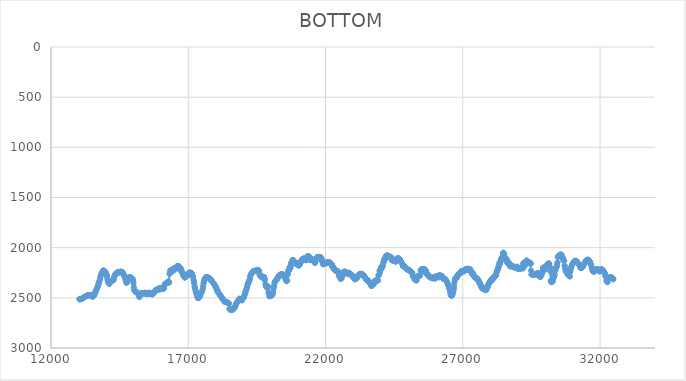
| Category | BOTTOM |
|---|---|
| 13032.9472 | 2514.32 |
| 13040.0809 | 2514.09 |
| 13050.3204 | 2513.85 |
| 13060.5605 | 2513.62 |
| 13070.8006 | 2513.38 |
| 13081.0407 | 2513.15 |
| 13091.2807 | 2512.92 |
| 13101.5208 | 2511.37 |
| 13111.7609 | 2509.81 |
| 13122.001 | 2508.24 |
| 13132.241 | 2506.68 |
| 13142.4811 | 2505.12 |
| 13152.7212 | 2503.55 |
| 13162.9612 | 2501.99 |
| 13173.2013 | 2500.42 |
| 13183.4414 | 2498.86 |
| 13193.6815 | 2496.93 |
| 13203.9215 | 2495 |
| 13214.1616 | 2493.06 |
| 13224.4017 | 2491.13 |
| 13234.6418 | 2489.19 |
| 13244.8818 | 2487.25 |
| 13255.1219 | 2485.32 |
| 13265.362 | 2483.38 |
| 13275.6021 | 2482.38 |
| 13285.8421 | 2481.4 |
| 13296.0822 | 2480.41 |
| 13306.3223 | 2479.43 |
| 13316.5624 | 2478.44 |
| 13326.8024 | 2477.46 |
| 13337.0425 | 2476.47 |
| 13347.2826 | 2475.49 |
| 13357.5226 | 2474.5 |
| 13367.7627 | 2473.51 |
| 13378.0028 | 2473.67 |
| 13388.2429 | 2473.85 |
| 13398.4829 | 2474.02 |
| 13408.723 | 2474.2 |
| 13418.9631 | 2474.37 |
| 13429.2032 | 2474.55 |
| 13439.4432 | 2474.73 |
| 13449.6833 | 2474.9 |
| 13459.9234 | 2477.21 |
| 13470.1635 | 2479.56 |
| 13480.4035 | 2481.9 |
| 13490.6436 | 2484.25 |
| 13500.8837 | 2486.6 |
| 13511.1238 | 2488.94 |
| 13521.3638 | 2486.45 |
| 13531.6039 | 2483.87 |
| 13541.844 | 2481.29 |
| 13552.084 | 2478.7 |
| 13562.3241 | 2476.12 |
| 13572.5642 | 2473.54 |
| 13582.8043 | 2466.03 |
| 13593.0443 | 2458.43 |
| 13603.2844 | 2450.83 |
| 13613.5245 | 2443.23 |
| 13623.7646 | 2435.63 |
| 13634.0046 | 2429.57 |
| 13644.2447 | 2423.54 |
| 13654.4848 | 2417.5 |
| 13664.7249 | 2411.47 |
| 13674.9649 | 2405.44 |
| 13685.205 | 2399.41 |
| 13695.4451 | 2393.37 |
| 13705.6852 | 2384.45 |
| 13715.9252 | 2375.48 |
| 13726.1653 | 2366.51 |
| 13736.4054 | 2357.53 |
| 13746.6454 | 2348.56 |
| 13756.8855 | 2339.59 |
| 13767.1256 | 2330.61 |
| 13777.3657 | 2321.64 |
| 13787.6057 | 2309.39 |
| 13797.8458 | 2297.07 |
| 13808.0859 | 2284.75 |
| 13818.326 | 2272.44 |
| 13828.566 | 2266.68 |
| 13838.8061 | 2261.05 |
| 13849.0462 | 2255.42 |
| 13859.2863 | 2249.79 |
| 13869.5263 | 2244.16 |
| 13879.7664 | 2238.53 |
| 13890.0065 | 2232.9 |
| 13900.2466 | 2227.27 |
| 13910.4866 | 2229.06 |
| 13920.7267 | 2231 |
| 13930.9668 | 2232.94 |
| 13941.2068 | 2234.87 |
| 13951.4469 | 2236.81 |
| 13961.687 | 2238.74 |
| 13971.9271 | 2240.68 |
| 13982.1671 | 2242.61 |
| 13992.4072 | 2249 |
| 14002.6473 | 2255.48 |
| 14012.8874 | 2261.95 |
| 14023.1274 | 2268.43 |
| 14033.3675 | 2274.9 |
| 14043.6076 | 2292.97 |
| 14053.8477 | 2311.27 |
| 14064.0877 | 2329.57 |
| 14074.3278 | 2336.27 |
| 14084.5679 | 2342.75 |
| 14094.808 | 2349.22 |
| 14105.048 | 2355.7 |
| 14115.2881 | 2362.17 |
| 14125.5282 | 2358.39 |
| 14135.7682 | 2354.4 |
| 14146.0083 | 2350.41 |
| 14156.2484 | 2346.42 |
| 14166.4885 | 2342.43 |
| 14176.7285 | 2338.45 |
| 14186.9686 | 2336.07 |
| 14197.2087 | 2333.72 |
| 14207.4488 | 2331.38 |
| 14217.6888 | 2329.03 |
| 14227.9289 | 2326.68 |
| 14238.169 | 2324.34 |
| 14248.4091 | 2324.29 |
| 14258.6491 | 2324.29 |
| 14268.8892 | 2324.29 |
| 14279.1293 | 2324.29 |
| 14289.3694 | 2308.43 |
| 14299.6094 | 2292.24 |
| 14309.8495 | 2285.85 |
| 14320.0896 | 2279.65 |
| 14330.3296 | 2273.46 |
| 14340.5697 | 2267.27 |
| 14350.8098 | 2261.07 |
| 14361.0499 | 2258.65 |
| 14371.2899 | 2256.3 |
| 14381.53 | 2253.96 |
| 14391.7701 | 2251.61 |
| 14402.0102 | 2249.27 |
| 14412.2502 | 2246.92 |
| 14422.4903 | 2246.87 |
| 14432.7304 | 2246.87 |
| 14442.9705 | 2246.87 |
| 14453.2105 | 2246.87 |
| 14463.4506 | 2246.87 |
| 14473.6907 | 2246.87 |
| 14483.9308 | 2246.87 |
| 14494.1708 | 2245.22 |
| 14504.4109 | 2243.53 |
| 14514.651 | 2241.84 |
| 14524.891 | 2240.15 |
| 14535.1311 | 2238.46 |
| 14545.3712 | 2239.57 |
| 14555.6113 | 2240.75 |
| 14565.8513 | 2241.92 |
| 14576.0914 | 2243.09 |
| 14586.3315 | 2244.27 |
| 14596.5716 | 2245.44 |
| 14606.8116 | 2244.09 |
| 14617.0517 | 2260.59 |
| 14627.2918 | 2256.81 |
| 14637.5319 | 2263.61 |
| 14647.7719 | 2272.03 |
| 14658.012 | 2277.72 |
| 14668.2521 | 2280.59 |
| 14678.4922 | 2283.41 |
| 14688.7322 | 2298.62 |
| 14698.9723 | 2301.71 |
| 14709.2124 | 2301.77 |
| 14719.4524 | 2325.18 |
| 14729.6925 | 2324.32 |
| 14739.9326 | 2349.08 |
| 14750.1727 | 2342.74 |
| 14760.4127 | 2349.48 |
| 14770.6528 | 2323.46 |
| 14780.8929 | 2325.64 |
| 14791.133 | 2322.94 |
| 14801.373 | 2328.39 |
| 14811.6131 | 2328.51 |
| 14821.8532 | 2300.98 |
| 14832.0933 | 2294.85 |
| 14842.3333 | 2300.24 |
| 14852.5734 | 2299.26 |
| 14862.8135 | 2298.13 |
| 14873.0536 | 2297.01 |
| 14883.2936 | 2295.88 |
| 14893.5337 | 2294.76 |
| 14903.7738 | 2297.48 |
| 14914.0139 | 2300.3 |
| 14924.2539 | 2303.11 |
| 14934.494 | 2305.93 |
| 14944.7341 | 2308.74 |
| 14954.9741 | 2311.56 |
| 14965.2142 | 2314.37 |
| 14975.4543 | 2308.93 |
| 14985.6944 | 2325.32 |
| 14995.9344 | 2332.58 |
| 15006.1745 | 2356.13 |
| 15016.4146 | 2392.44 |
| 15026.6547 | 2415.28 |
| 15036.8947 | 2422.67 |
| 15047.1348 | 2429.7 |
| 15057.3749 | 2427.11 |
| 15067.615 | 2433.93 |
| 15077.855 | 2440.96 |
| 15088.0951 | 2439.75 |
| 15098.3352 | 2439.72 |
| 15108.5753 | 2445.22 |
| 15118.8153 | 2445.35 |
| 15129.0554 | 2445.35 |
| 15139.2955 | 2450.85 |
| 15149.5355 | 2450.98 |
| 15159.7756 | 2453.73 |
| 15170.0157 | 2453.79 |
| 15180.2558 | 2459.29 |
| 15190.4958 | 2463.55 |
| 15200.7359 | 2473.27 |
| 15210.976 | 2484.5 |
| 15221.2161 | 2494.38 |
| 15231.4561 | 2472.61 |
| 15241.6962 | 2466.59 |
| 15251.9363 | 2466.46 |
| 15262.1764 | 2459.59 |
| 15272.4164 | 2458.05 |
| 15282.6565 | 2456.64 |
| 15292.8966 | 2449.73 |
| 15303.1367 | 2453.69 |
| 15313.3767 | 2452.42 |
| 15323.6168 | 2456.51 |
| 15333.8569 | 2453.86 |
| 15344.097 | 2453.79 |
| 15354.337 | 2453.79 |
| 15364.5771 | 2455.17 |
| 15374.8172 | 2452.45 |
| 15385.0572 | 2456.51 |
| 15395.2973 | 2456.61 |
| 15405.5374 | 2451.11 |
| 15415.7775 | 2450.98 |
| 15426.0175 | 2450.98 |
| 15436.2576 | 2448.23 |
| 15446.4977 | 2450.91 |
| 15456.7378 | 2460.59 |
| 15466.9778 | 2460.83 |
| 15477.2179 | 2460.83 |
| 15487.458 | 2460.83 |
| 15497.6981 | 2460.83 |
| 15507.9381 | 2460.83 |
| 15518.1782 | 2460.83 |
| 15528.4183 | 2460.83 |
| 15538.6584 | 2460.83 |
| 15548.8984 | 2451.22 |
| 15559.1385 | 2448.23 |
| 15569.3786 | 2450.91 |
| 15579.6186 | 2460.59 |
| 15589.8587 | 2460.83 |
| 15600.0988 | 2460.83 |
| 15610.3389 | 2460.83 |
| 15620.5789 | 2460.83 |
| 15630.819 | 2460.83 |
| 15641.0591 | 2455.34 |
| 15651.2992 | 2457.4 |
| 15661.5392 | 2459.65 |
| 15671.7793 | 2461.9 |
| 15682.0194 | 2464.15 |
| 15692.2595 | 2466.4 |
| 15702.4995 | 2463.44 |
| 15712.7396 | 2460.34 |
| 15722.9797 | 2457.25 |
| 15733.2198 | 2454.15 |
| 15743.4598 | 2451.05 |
| 15753.6999 | 2441.37 |
| 15763.94 | 2443.87 |
| 15774.1801 | 2442.57 |
| 15784.4201 | 2435.67 |
| 15794.6602 | 2435.49 |
| 15804.9003 | 2425.89 |
| 15815.1403 | 2421.52 |
| 15825.3804 | 2425.53 |
| 15835.6205 | 2422.89 |
| 15845.8606 | 2420.08 |
| 15856.1006 | 2415.89 |
| 15866.3407 | 2414.41 |
| 15876.5808 | 2414.38 |
| 15886.8209 | 2415.75 |
| 15897.0609 | 2414.41 |
| 15907.301 | 2414.38 |
| 15917.5411 | 2413.01 |
| 15927.7812 | 2419.83 |
| 15938.0212 | 2411.78 |
| 15948.2613 | 2403.33 |
| 15958.5014 | 2405.86 |
| 15968.7415 | 2404.56 |
| 15978.9815 | 2404.53 |
| 15989.2216 | 2414.13 |
| 15999.4617 | 2414.38 |
| 16009.7018 | 2403.41 |
| 16019.9418 | 2403.12 |
| 16030.1819 | 2403.12 |
| 16040.422 | 2404.49 |
| 16050.662 | 2404.53 |
| 16060.9021 | 2405.9 |
| 16071.1422 | 2405.93 |
| 16081.3823 | 2401.82 |
| 16091.6223 | 2408.56 |
| 16101.8624 | 2408.75 |
| 16112.1025 | 2407.38 |
| 16122.3426 | 2404.6 |
| 16132.5826 | 2371.63 |
| 16142.8227 | 2368 |
| 16153.0628 | 2363.81 |
| 16163.3029 | 2358.22 |
| 16173.5429 | 2360.81 |
| 16183.783 | 2359.52 |
| 16194.0231 | 2354 |
| 16204.2632 | 2355.22 |
| 16214.5032 | 2348.41 |
| 16224.7433 | 2348.22 |
| 16234.9834 | 2346.85 |
| 16245.2235 | 2341.33 |
| 16255.4635 | 2350.77 |
| 16265.7036 | 2338.7 |
| 16275.9437 | 2341.11 |
| 16286.1837 | 2341.18 |
| 16296.4238 | 2339.81 |
| 16306.6639 | 2347.99 |
| 16316.904 | 2260.55 |
| 16327.144 | 2258.13 |
| 16337.3841 | 2228 |
| 16347.6242 | 2249.08 |
| 16357.8643 | 2223.66 |
| 16368.1043 | 2225.68 |
| 16378.3444 | 2225.76 |
| 16388.5845 | 2224.39 |
| 16398.8246 | 2242.15 |
| 16409.0646 | 2220.74 |
| 16419.3047 | 2217.39 |
| 16429.5448 | 2217.31 |
| 16439.7849 | 2215.94 |
| 16450.0249 | 2217.27 |
| 16460.265 | 2209.1 |
| 16470.5051 | 2210.24 |
| 16480.7452 | 2207.54 |
| 16490.9852 | 2206.09 |
| 16501.2253 | 2223.85 |
| 16511.4654 | 2210.66 |
| 16521.7054 | 2207.54 |
| 16531.9455 | 2203.35 |
| 16542.1856 | 2205.97 |
| 16552.4257 | 2195.1 |
| 16562.6657 | 2194.79 |
| 16572.9058 | 2203 |
| 16583.1459 | 2185.44 |
| 16593.386 | 2184.94 |
| 16603.626 | 2184.94 |
| 16613.8661 | 2182.2 |
| 16624.1062 | 2182.12 |
| 16634.3463 | 2183.49 |
| 16644.5863 | 2183.53 |
| 16654.8264 | 2195.84 |
| 16665.0665 | 2194.83 |
| 16675.3066 | 2193.42 |
| 16685.5466 | 2198.86 |
| 16695.7867 | 2196.28 |
| 16706.0268 | 2223.56 |
| 16716.2669 | 2214.77 |
| 16726.5069 | 2206.29 |
| 16736.747 | 2214.26 |
| 16746.9871 | 2221.34 |
| 16757.2271 | 2232.48 |
| 16767.4672 | 2245.11 |
| 16777.7073 | 2245.46 |
| 16787.9474 | 2248.2 |
| 16798.1874 | 2257.85 |
| 16808.4275 | 2267.71 |
| 16818.6676 | 2277.56 |
| 16828.9077 | 2279.21 |
| 16839.1477 | 2279.25 |
| 16849.3878 | 2280.61 |
| 16859.6279 | 2287.49 |
| 16869.868 | 2298.63 |
| 16880.108 | 2297.59 |
| 16890.3481 | 2287.98 |
| 16900.5882 | 2286.33 |
| 16910.8283 | 2286.29 |
| 16921.0683 | 2287.65 |
| 16931.3084 | 2282.22 |
| 16941.5485 | 2286.16 |
| 16951.7886 | 2275.35 |
| 16962.0286 | 2275.02 |
| 16972.2687 | 2268.19 |
| 16982.5088 | 2258.42 |
| 16992.7488 | 2269.07 |
| 17002.9889 | 2270.76 |
| 17013.229 | 2268.07 |
| 17023.4691 | 2267.99 |
| 17033.7091 | 2257.05 |
| 17043.9492 | 2248.53 |
| 17054.1893 | 2248.28 |
| 17064.4294 | 2249.65 |
| 17074.6694 | 2249.69 |
| 17084.9095 | 2249.69 |
| 17095.1496 | 2251.05 |
| 17105.3897 | 2252.46 |
| 17115.6297 | 2252.5 |
| 17125.8698 | 2256.6 |
| 17136.1099 | 2270.39 |
| 17146.35 | 2277.63 |
| 17156.59 | 2280.57 |
| 17166.8301 | 2283.39 |
| 17177.0702 | 2288.93 |
| 17187.3103 | 2319.15 |
| 17197.5503 | 2325.53 |
| 17207.7904 | 2351.65 |
| 17218.0305 | 2352.44 |
| 17228.2706 | 2385.22 |
| 17238.5106 | 2394.42 |
| 17248.7507 | 2408.33 |
| 17258.9908 | 2419.67 |
| 17269.2308 | 2433.66 |
| 17279.4709 | 2445.01 |
| 17289.711 | 2446.71 |
| 17299.9511 | 2464.5 |
| 17310.1911 | 2467.78 |
| 17320.4312 | 2470.6 |
| 17330.6713 | 2485.7 |
| 17340.9114 | 2501.18 |
| 17351.1514 | 2501.65 |
| 17361.3915 | 2498.92 |
| 17371.6316 | 2501.57 |
| 17381.8717 | 2501.65 |
| 17392.1117 | 2497.21 |
| 17402.3518 | 2492.64 |
| 17412.5919 | 2488.07 |
| 17422.832 | 2483.49 |
| 17433.072 | 2473.8 |
| 17443.3121 | 2463.95 |
| 17453.5522 | 2454.09 |
| 17463.7923 | 2450.24 |
| 17474.0323 | 2446.58 |
| 17484.2724 | 2442.92 |
| 17494.5125 | 2439.26 |
| 17504.7526 | 2435.61 |
| 17514.9926 | 2423.21 |
| 17525.2327 | 2410.55 |
| 17535.4728 | 2397.88 |
| 17545.7128 | 2377.02 |
| 17555.9529 | 2355.91 |
| 17566.193 | 2343.89 |
| 17576.4331 | 2332.16 |
| 17586.6731 | 2320.43 |
| 17596.9132 | 2315.16 |
| 17607.1533 | 2310.09 |
| 17617.3934 | 2305.02 |
| 17627.6334 | 2299.96 |
| 17637.8735 | 2294.89 |
| 17648.1136 | 2293.37 |
| 17658.3537 | 2291.96 |
| 17668.5937 | 2292.94 |
| 17678.8338 | 2293.99 |
| 17689.0739 | 2295.05 |
| 17699.314 | 2296.11 |
| 17709.554 | 2297.16 |
| 17719.7941 | 2298.22 |
| 17730.0342 | 2299.27 |
| 17740.2743 | 2300.33 |
| 17750.5143 | 2302.07 |
| 17760.7544 | 2303.82 |
| 17770.9945 | 2305.58 |
| 17781.2346 | 2307.34 |
| 17791.4746 | 2310.67 |
| 17801.7147 | 2314.05 |
| 17811.9548 | 2317.43 |
| 17822.1948 | 2320.81 |
| 17832.4349 | 2324.18 |
| 17842.675 | 2327.7 |
| 17852.9151 | 2331.22 |
| 17863.1551 | 2334.74 |
| 17873.3952 | 2338.25 |
| 17883.6353 | 2341.77 |
| 17893.8754 | 2345.29 |
| 17904.1154 | 2348.81 |
| 17914.3555 | 2352.33 |
| 17924.5956 | 2356.8 |
| 17934.8357 | 2361.31 |
| 17945.0757 | 2365.81 |
| 17955.3158 | 2370.32 |
| 17965.5559 | 2374.82 |
| 17975.796 | 2379.87 |
| 17986.036 | 2384.94 |
| 17996.2761 | 2390 |
| 18006.5162 | 2395.07 |
| 18016.7563 | 2400.14 |
| 18026.9963 | 2407.11 |
| 18037.2364 | 2414.15 |
| 18047.4765 | 2421.19 |
| 18057.7166 | 2428.23 |
| 18067.9566 | 2435.26 |
| 18078.1967 | 2439.58 |
| 18088.4368 | 2443.8 |
| 18098.6768 | 2448.02 |
| 18108.9169 | 2452.25 |
| 18119.157 | 2456.47 |
| 18129.3971 | 2460.69 |
| 18139.6371 | 2464.91 |
| 18149.8772 | 2469.14 |
| 18160.1173 | 2473.13 |
| 18170.3574 | 2477.12 |
| 18180.5974 | 2481.11 |
| 18190.8375 | 2485.1 |
| 18201.0776 | 2489.08 |
| 18211.3177 | 2493.07 |
| 18221.5577 | 2497.46 |
| 18231.7978 | 2501.86 |
| 18242.0379 | 2506.26 |
| 18252.278 | 2510.65 |
| 18262.518 | 2515.05 |
| 18272.7581 | 2519.45 |
| 18282.9982 | 2523.85 |
| 18293.2383 | 2528.25 |
| 18303.4783 | 2528.4 |
| 18313.7184 | 2535.2 |
| 18323.9585 | 2535.43 |
| 18334.1986 | 2540.88 |
| 18344.4386 | 2538.34 |
| 18354.6787 | 2539.61 |
| 18364.9188 | 2541.02 |
| 18375.1588 | 2541.06 |
| 18385.3989 | 2541.06 |
| 18395.639 | 2542.42 |
| 18405.8791 | 2542.47 |
| 18416.1191 | 2547.91 |
| 18426.3592 | 2548.1 |
| 18436.5993 | 2548.1 |
| 18446.8394 | 2549.46 |
| 18457.0794 | 2550.87 |
| 18467.3195 | 2553.64 |
| 18477.5596 | 2553.73 |
| 18487.7997 | 2556.45 |
| 18498.0397 | 2609.58 |
| 18508.2798 | 2607.37 |
| 18518.5199 | 2619.46 |
| 18528.76 | 2617.17 |
| 18539.0 | 2607.56 |
| 18549.2401 | 2615.38 |
| 18559.4802 | 2615.67 |
| 18569.7203 | 2614.31 |
| 18579.9603 | 2615.62 |
| 18590.2004 | 2615.67 |
| 18600.4405 | 2617.03 |
| 18610.6806 | 2615.72 |
| 18620.9206 | 2615.67 |
| 18631.1607 | 2614.31 |
| 18641.4008 | 2614.26 |
| 18651.6409 | 2611.54 |
| 18661.8809 | 2607.37 |
| 18672.121 | 2603.15 |
| 18682.3611 | 2598.92 |
| 18692.6011 | 2594.7 |
| 18702.8412 | 2590.48 |
| 18713.0813 | 2581.73 |
| 18723.3214 | 2572.81 |
| 18733.5614 | 2563.9 |
| 18743.8015 | 2559.41 |
| 18754.0416 | 2555.07 |
| 18764.2817 | 2550.74 |
| 18774.5217 | 2546.41 |
| 18784.7618 | 2542.08 |
| 18795.0019 | 2537.75 |
| 18805.242 | 2533.42 |
| 18815.482 | 2529.09 |
| 18825.7221 | 2524.76 |
| 18835.9622 | 2520.43 |
| 18846.2023 | 2516.1 |
| 18856.4423 | 2511.76 |
| 18866.6824 | 2507.43 |
| 18876.9225 | 2510.68 |
| 18887.1626 | 2514.19 |
| 18897.4026 | 2512.96 |
| 18907.6427 | 2518.34 |
| 18917.8828 | 2521.26 |
| 18928.1229 | 2521.36 |
| 18938.3629 | 2522.71 |
| 18948.603 | 2525.48 |
| 18958.8431 | 2525.58 |
| 18969.0831 | 2512 |
| 18979.3232 | 2506.07 |
| 18989.5633 | 2503.16 |
| 18999.8034 | 2500.34 |
| 19010.0434 | 2497.53 |
| 19020.2835 | 2494.71 |
| 19030.5236 | 2491.9 |
| 19040.7637 | 2481.84 |
| 19051.0037 | 2471.52 |
| 19061.2438 | 2461.2 |
| 19071.4839 | 2452.88 |
| 19081.724 | 2444.64 |
| 19091.964 | 2436.39 |
| 19102.2041 | 2428.15 |
| 19112.4442 | 2419.9 |
| 19122.6843 | 2411.66 |
| 19132.9243 | 2403.42 |
| 19143.1644 | 2390.45 |
| 19153.4045 | 2377.32 |
| 19163.6446 | 2364.18 |
| 19173.8846 | 2357.7 |
| 19184.1247 | 2351.46 |
| 19194.3648 | 2345.23 |
| 19204.6049 | 2339 |
| 19214.8449 | 2332.76 |
| 19225.085 | 2326.53 |
| 19235.3251 | 2320.3 |
| 19245.5652 | 2305.15 |
| 19255.8052 | 2289.67 |
| 19266.0453 | 2274.18 |
| 19276.2854 | 2269.4 |
| 19286.5255 | 2265.02 |
| 19296.7655 | 2260.64 |
| 19307.0056 | 2256.26 |
| 19317.2457 | 2251.88 |
| 19327.4857 | 2247.5 |
| 19337.7258 | 2243.12 |
| 19347.9659 | 2238.74 |
| 19358.206 | 2234.37 |
| 19368.446 | 2233.73 |
| 19378.6861 | 2233.23 |
| 19388.9262 | 2232.73 |
| 19399.1663 | 2232.23 |
| 19409.4063 | 2231.74 |
| 19419.6464 | 2231.24 |
| 19429.8865 | 2230.74 |
| 19440.1266 | 2230.25 |
| 19450.3666 | 2229.75 |
| 19460.6067 | 2229.25 |
| 19470.8468 | 2228.76 |
| 19481.0869 | 2228.26 |
| 19491.3269 | 2227.76 |
| 19501.567 | 2227.27 |
| 19511.8071 | 2226.77 |
| 19522.0472 | 2226.27 |
| 19532.2872 | 2225.78 |
| 19542.5273 | 2224.4 |
| 19552.7674 | 2224.35 |
| 19563.0075 | 2227.06 |
| 19573.2475 | 2228.52 |
| 19583.4876 | 2242.12 |
| 19593.7277 | 2268.39 |
| 19603.9678 | 2277.52 |
| 19614.2078 | 2279.19 |
| 19624.4479 | 2272.47 |
| 19634.688 | 2281.69 |
| 19644.928 | 2278 |
| 19655.1681 | 2294.09 |
| 19665.4082 | 2279.83 |
| 19675.6483 | 2280.6 |
| 19685.8883 | 2287.43 |
| 19696.1284 | 2290.4 |
| 19706.3685 | 2291.86 |
| 19716.6086 | 2290.56 |
| 19726.8486 | 2290.51 |
| 19737.0887 | 2291.86 |
| 19747.3288 | 2291.92 |
| 19757.5689 | 2291.92 |
| 19767.8089 | 2295.98 |
| 19778.049 | 2320.51 |
| 19788.2891 | 2317.41 |
| 19798.5292 | 2318.61 |
| 19808.7692 | 2360.62 |
| 19819.0093 | 2381.25 |
| 19829.2494 | 2382 |
| 19839.4895 | 2380.65 |
| 19849.7295 | 2380.6 |
| 19859.9696 | 2399.54 |
| 19870.2097 | 2392.18 |
| 19880.4498 | 2382.38 |
| 19890.6898 | 2398.24 |
| 19900.9299 | 2389.42 |
| 19911.17 | 2390.39 |
| 19921.4101 | 2445.92 |
| 19931.6501 | 2458.99 |
| 19941.8902 | 2456.72 |
| 19952.1303 | 2485.02 |
| 19962.3704 | 2478.05 |
| 19972.6104 | 2483.13 |
| 19982.8505 | 2480.65 |
| 19993.0906 | 2480.54 |
| 20003.3306 | 2480.54 |
| 20013.5707 | 2475.13 |
| 20023.8108 | 2477.61 |
| 20034.0509 | 2477.72 |
| 20044.2909 | 2472.31 |
| 20054.531 | 2468.03 |
| 20064.7711 | 2467.87 |
| 20075.0112 | 2458.4 |
| 20085.2512 | 2456.66 |
| 20095.4913 | 2436.32 |
| 20105.7314 | 2408.45 |
| 20115.9715 | 2393.82 |
| 20126.2115 | 2379.74 |
| 20136.4516 | 2354.85 |
| 20146.6917 | 2345.74 |
| 20156.9318 | 2337.29 |
| 20167.1718 | 2335.61 |
| 20177.4119 | 2332.85 |
| 20187.652 | 2324.63 |
| 20197.8921 | 2329.7 |
| 20208.1321 | 2319.11 |
| 20218.3722 | 2315.96 |
| 20228.6123 | 2314.49 |
| 20238.8524 | 2314.44 |
| 20249.0924 | 2313.09 |
| 20259.3325 | 2295.46 |
| 20269.5726 | 2300.14 |
| 20279.8127 | 2285.5 |
| 20290.0527 | 2284.88 |
| 20300.2928 | 2284.88 |
| 20310.5329 | 2279.47 |
| 20320.773 | 2277.9 |
| 20331.013 | 2277.84 |
| 20341.2531 | 2275.14 |
| 20351.4932 | 2266.92 |
| 20361.7333 | 2271.98 |
| 20371.9733 | 2272.21 |
| 20382.2134 | 2270.86 |
| 20392.4535 | 2269.45 |
| 20402.6935 | 2266.69 |
| 20412.9336 | 2262.53 |
| 20423.1737 | 2274.51 |
| 20433.4138 | 2265.57 |
| 20443.6538 | 2263.82 |
| 20453.8939 | 2271.87 |
| 20464.134 | 2270.86 |
| 20474.3741 | 2276.2 |
| 20484.6141 | 2291.29 |
| 20494.8542 | 2281.11 |
| 20505.0943 | 2291.46 |
| 20515.3344 | 2293.27 |
| 20525.5744 | 2301.42 |
| 20535.8145 | 2301.77 |
| 20546.0546 | 2297.72 |
| 20556.2947 | 2302.95 |
| 20566.5347 | 2330.18 |
| 20576.7748 | 2335.38 |
| 20587.0149 | 2328.8 |
| 20597.255 | 2328.51 |
| 20607.495 | 2328.51 |
| 20617.7351 | 2259.67 |
| 20627.9752 | 2266.17 |
| 20638.2153 | 2231.49 |
| 20648.4553 | 2231.33 |
| 20658.6954 | 2227.34 |
| 20668.9355 | 2224.47 |
| 20679.1756 | 2223 |
| 20689.4156 | 2195.95 |
| 20699.6557 | 2193.44 |
| 20709.8958 | 2202.83 |
| 20720.1359 | 2183 |
| 20730.3759 | 2196.96 |
| 20740.616 | 2157.13 |
| 20750.8561 | 2155.38 |
| 20761.0962 | 2147.28 |
| 20771.3362 | 2145.58 |
| 20781.5763 | 2149.57 |
| 20791.8164 | 2122.77 |
| 20802.0564 | 2140.48 |
| 20812.2965 | 2123.77 |
| 20822.5366 | 2123 |
| 20832.7767 | 2147.28 |
| 20843.0167 | 2155.08 |
| 20853.2568 | 2140.54 |
| 20863.4969 | 2145.29 |
| 20873.737 | 2145.52 |
| 20883.977 | 2153.62 |
| 20894.2171 | 2144.53 |
| 20904.4572 | 2157.6 |
| 20914.6973 | 2154.15 |
| 20924.9373 | 2154.64 |
| 20935.1774 | 2155.35 |
| 20945.4175 | 2156.05 |
| 20955.6576 | 2156.75 |
| 20965.8976 | 2160.38 |
| 20976.1377 | 2164.13 |
| 20986.3778 | 2167.89 |
| 20996.6179 | 2171.64 |
| 21006.8579 | 2175.39 |
| 21017.098 | 2179.15 |
| 21027.3381 | 2176.95 |
| 21037.5782 | 2174.48 |
| 21047.8182 | 2172.02 |
| 21058.0583 | 2169.56 |
| 21068.2984 | 2163.22 |
| 21078.5385 | 2156.71 |
| 21088.7785 | 2150.2 |
| 21099.0186 | 2143.69 |
| 21109.2587 | 2137.18 |
| 21119.4988 | 2130.67 |
| 21129.7388 | 2124.16 |
| 21139.9789 | 2117.65 |
| 21150.219 | 2115.8 |
| 21160.4591 | 2114.16 |
| 21170.6991 | 2112.52 |
| 21180.9392 | 2110.87 |
| 21191.1793 | 2109.23 |
| 21201.4193 | 2107.59 |
| 21211.6594 | 2110.21 |
| 21221.8995 | 2111.68 |
| 21232.1396 | 2113.09 |
| 21242.3796 | 2122.58 |
| 21252.6197 | 2124.35 |
| 21262.8598 | 2124.41 |
| 21273.0999 | 2123.06 |
| 21283.3399 | 2124.35 |
| 21293.58 | 2124.41 |
| 21303.8201 | 2117.68 |
| 21314.0602 | 2095.83 |
| 21324.3002 | 2094.85 |
| 21334.5403 | 2089.46 |
| 21344.7804 | 2087.87 |
| 21355.0205 | 2085.12 |
| 21365.2605 | 2083.65 |
| 21375.5006 | 2083.59 |
| 21385.7407 | 2087.63 |
| 21395.9808 | 2086.47 |
| 21406.2208 | 2091.79 |
| 21416.4609 | 2093.38 |
| 21426.701 | 2094.79 |
| 21436.9411 | 2124.46 |
| 21447.1811 | 2123.13 |
| 21457.4212 | 2123 |
| 21467.6613 | 2124.35 |
| 21477.9014 | 2124.41 |
| 21488.1414 | 2123.06 |
| 21498.3815 | 2117.62 |
| 21508.6216 | 2117.37 |
| 21518.8617 | 2117.37 |
| 21529.1017 | 2121.41 |
| 21539.3418 | 2118.9 |
| 21549.5819 | 2121.47 |
| 21559.822 | 2131.01 |
| 21570.062 | 2130.1 |
| 21580.3021 | 2130.04 |
| 21590.5422 | 2134.08 |
| 21600.7823 | 2147.72 |
| 21611.0223 | 2151.03 |
| 21621.2624 | 2152.5 |
| 21631.5025 | 2136.42 |
| 21641.7426 | 2115.49 |
| 21651.9826 | 2107.83 |
| 21662.2227 | 2108.86 |
| 21672.4628 | 2107.58 |
| 21682.7028 | 2099.45 |
| 21692.9429 | 2093.69 |
| 21703.183 | 2097.48 |
| 21713.4231 | 2093.63 |
| 21723.6631 | 2092.1 |
| 21733.9032 | 2094.72 |
| 21744.1433 | 2092.16 |
| 21754.3834 | 2092.03 |
| 21764.6234 | 2092.03 |
| 21774.8635 | 2092.03 |
| 21785.1036 | 2093.38 |
| 21795.3437 | 2093.44 |
| 21805.5837 | 2096.13 |
| 21815.8238 | 2097.6 |
| 21826.0639 | 2097.66 |
| 21836.304 | 2101.7 |
| 21846.544 | 2105.92 |
| 21856.7841 | 2134.34 |
| 21867.0242 | 2131.64 |
| 21877.2643 | 2130.1 |
| 21887.5043 | 2126.01 |
| 21897.7444 | 2129.85 |
| 21907.9845 | 2166.32 |
| 21918.2246 | 2164.01 |
| 21928.4646 | 2159.79 |
| 21938.7047 | 2160.94 |
| 21948.9448 | 2158.32 |
| 21959.1849 | 2156.85 |
| 21969.4249 | 2156.78 |
| 21979.665 | 2155.44 |
| 21989.9051 | 2155.38 |
| 22000.1452 | 2152.69 |
| 22010.3852 | 2153.91 |
| 22020.6253 | 2153.97 |
| 22030.8654 | 2155.31 |
| 22041.1055 | 2155.38 |
| 22051.3455 | 2152.69 |
| 22061.5856 | 2152.56 |
| 22071.8257 | 2145.85 |
| 22082.0658 | 2144.18 |
| 22092.3058 | 2145.46 |
| 22102.5459 | 2145.52 |
| 22112.786 | 2145.52 |
| 22123.0261 | 2145.52 |
| 22133.2661 | 2146.87 |
| 22143.5062 | 2146.93 |
| 22153.7463 | 2148.27 |
| 22163.9864 | 2152.37 |
| 22174.2264 | 2156.59 |
| 22184.4665 | 2158.13 |
| 22194.7066 | 2159.53 |
| 22204.9466 | 2163.63 |
| 22215.1867 | 2163.82 |
| 22225.4268 | 2163.82 |
| 22235.6669 | 2167.85 |
| 22245.9069 | 2188.18 |
| 22256.147 | 2186.48 |
| 22266.3871 | 2187.69 |
| 22276.6272 | 2187.75 |
| 22286.8672 | 2207.88 |
| 22297.1073 | 2204.84 |
| 22307.3474 | 2201.96 |
| 22317.5875 | 2216.59 |
| 22327.8275 | 2218.65 |
| 22338.0676 | 2218.72 |
| 22348.3077 | 2220.06 |
| 22358.5478 | 2229.52 |
| 22368.7878 | 2229.98 |
| 22379.0279 | 2227.3 |
| 22389.268 | 2228.51 |
| 22399.5081 | 2231.26 |
| 22409.7481 | 2232.73 |
| 22419.9882 | 2231.45 |
| 22430.2283 | 2231.39 |
| 22440.4684 | 2235.41 |
| 22450.7084 | 2239.63 |
| 22460.9485 | 2238.49 |
| 22471.1886 | 2239.77 |
| 22481.4287 | 2278.73 |
| 22491.6687 | 2282 |
| 22501.9088 | 2280.72 |
| 22512.1489 | 2284.68 |
| 22522.389 | 2288.9 |
| 22532.629 | 2293.12 |
| 22542.8691 | 2308.07 |
| 22553.1092 | 2311.49 |
| 22563.3493 | 2308.94 |
| 22573.5893 | 2304.79 |
| 22583.8294 | 2307.27 |
| 22594.0695 | 2285.95 |
| 22604.3096 | 2283.54 |
| 22614.5496 | 2284.81 |
| 22624.7897 | 2252.71 |
| 22635.0298 | 2247.07 |
| 22645.2699 | 2246.87 |
| 22655.5099 | 2246.87 |
| 22665.75 | 2242.85 |
| 22675.9901 | 2239.97 |
| 22686.2302 | 2241.17 |
| 22696.4702 | 2237.22 |
| 22706.7103 | 2239.7 |
| 22716.9504 | 2241.17 |
| 22727.1905 | 2243.92 |
| 22737.4305 | 2244.06 |
| 22747.6706 | 2245.4 |
| 22757.9107 | 2248.14 |
| 22768.1507 | 2252.3 |
| 22778.3908 | 2251.16 |
| 22788.6309 | 2255.11 |
| 22798.871 | 2259.34 |
| 22809.111 | 2263.56 |
| 22819.3511 | 2259.74 |
| 22829.5912 | 2259.54 |
| 22839.8313 | 2263.56 |
| 22850.0713 | 2253.05 |
| 22860.3114 | 2248.48 |
| 22870.5515 | 2252.3 |
| 22880.7916 | 2256.52 |
| 22891.0316 | 2264.76 |
| 22901.2717 | 2265.17 |
| 22911.5118 | 2261.15 |
| 22921.7519 | 2264.97 |
| 22931.9919 | 2269.19 |
| 22942.232 | 2272.07 |
| 22952.4721 | 2278.9 |
| 22962.7122 | 2280.59 |
| 22972.9522 | 2284.67 |
| 22983.1923 | 2280.86 |
| 22993.4324 | 2279.32 |
| 23003.6725 | 2283.26 |
| 23013.9125 | 2298.2 |
| 23024.1526 | 2296.28 |
| 23034.3927 | 2297.48 |
| 23044.6328 | 2301.56 |
| 23054.8728 | 2305.78 |
| 23065.1129 | 2316.7 |
| 23075.353 | 2313.24 |
| 23085.5931 | 2309.02 |
| 23095.8331 | 2311.48 |
| 23106.0732 | 2311.62 |
| 23116.3133 | 2306.27 |
| 23126.5534 | 2301.98 |
| 23136.7934 | 2301.77 |
| 23147.0335 | 2304.45 |
| 23157.2736 | 2295.22 |
| 23167.5137 | 2290.72 |
| 23177.7537 | 2286.49 |
| 23187.9938 | 2276.92 |
| 23198.2339 | 2272.42 |
| 23208.474 | 2272.21 |
| 23218.714 | 2268.2 |
| 23228.9541 | 2266.65 |
| 23239.1942 | 2266.58 |
| 23249.4343 | 2263.9 |
| 23259.6743 | 2259.75 |
| 23269.9144 | 2260.88 |
| 23280.1545 | 2262.29 |
| 23290.3946 | 2262.36 |
| 23300.6346 | 2262.36 |
| 23310.8747 | 2262.36 |
| 23321.1148 | 2261.02 |
| 23331.3549 | 2264.96 |
| 23341.5949 | 2266.51 |
| 23351.835 | 2273.26 |
| 23362.0751 | 2270.94 |
| 23372.3152 | 2272.14 |
| 23382.5552 | 2274.88 |
| 23392.7953 | 2279.03 |
| 23403.0354 | 2283.26 |
| 23413.2754 | 2286.14 |
| 23423.5155 | 2288.96 |
| 23433.7556 | 2295.78 |
| 23443.9957 | 2300.15 |
| 23454.2357 | 2304.37 |
| 23464.4758 | 2315.28 |
| 23474.7159 | 2311.84 |
| 23484.956 | 2312.96 |
| 23495.196 | 2317.04 |
| 23505.4361 | 2319.93 |
| 23515.6762 | 2324.08 |
| 23525.9163 | 2322.95 |
| 23536.1563 | 2321.55 |
| 23546.3964 | 2325.48 |
| 23556.6365 | 2328.37 |
| 23566.8766 | 2339.2 |
| 23577.1166 | 2338.44 |
| 23587.3567 | 2341.04 |
| 23597.5968 | 2341.18 |
| 23607.8369 | 2341.18 |
| 23618.0769 | 2355.88 |
| 23628.317 | 2355.33 |
| 23638.5571 | 2359.27 |
| 23648.7972 | 2362.15 |
| 23659.0372 | 2379.66 |
| 23669.2773 | 2377.92 |
| 23679.5174 | 2381.79 |
| 23689.7575 | 2382 |
| 23699.9975 | 2368.65 |
| 23710.2376 | 2367.93 |
| 23720.4777 | 2363.92 |
| 23730.7178 | 2363.7 |
| 23740.9578 | 2361.03 |
| 23751.1979 | 2360.89 |
| 23761.438 | 2363.56 |
| 23771.6781 | 2342.34 |
| 23781.9181 | 2337.18 |
| 23792.1582 | 2335.62 |
| 23802.3983 | 2331.55 |
| 23812.6384 | 2327.32 |
| 23822.8784 | 2328.44 |
| 23833.1185 | 2328.51 |
| 23843.3586 | 2329.85 |
| 23853.5987 | 2327.25 |
| 23863.8387 | 2327.11 |
| 23874.0788 | 2327.11 |
| 23884.3189 | 2325.77 |
| 23894.559 | 2324.36 |
| 23904.799 | 2326.96 |
| 23915.0391 | 2327.11 |
| 23925.2792 | 2276.4 |
| 23935.5193 | 2269.61 |
| 23945.7593 | 2268.06 |
| 23955.9994 | 2270.65 |
| 23966.2395 | 2229.44 |
| 23976.4796 | 2231.17 |
| 23986.7196 | 2247.4 |
| 23996.9597 | 2220.26 |
| 24007.1998 | 2214.72 |
| 24017.4399 | 2199.82 |
| 24027.6799 | 2200.35 |
| 24037.92 | 2192.42 |
| 24048.1601 | 2209.31 |
| 24058.4002 | 2186.27 |
| 24068.6402 | 2186.27 |
| 24078.8803 | 2177.01 |
| 24089.1204 | 2181.83 |
| 24099.3605 | 2147.45 |
| 24109.6005 | 2145.52 |
| 24119.8406 | 2145.52 |
| 24130.0807 | 2118.85 |
| 24140.3208 | 2114.7 |
| 24150.5608 | 2113.22 |
| 24160.8009 | 2111.82 |
| 24171.041 | 2111.74 |
| 24181.2811 | 2093.08 |
| 24191.5211 | 2112.03 |
| 24201.7612 | 2083.82 |
| 24212.0013 | 2080.85 |
| 24222.2414 | 2079.44 |
| 24232.4814 | 2078.03 |
| 24242.7215 | 2077.96 |
| 24252.9616 | 2079.29 |
| 24263.2016 | 2082.03 |
| 24273.4417 | 2082.18 |
| 24283.6818 | 2082.18 |
| 24293.9219 | 2082.18 |
| 24304.1619 | 2083.51 |
| 24314.402 | 2086.25 |
| 24324.6421 | 2089.07 |
| 24334.8822 | 2094.55 |
| 24345.1222 | 2094.85 |
| 24355.3623 | 2096.18 |
| 24365.6024 | 2096.26 |
| 24375.8425 | 2094.92 |
| 24386.0825 | 2094.85 |
| 24396.3226 | 2098.85 |
| 24406.5627 | 2100.4 |
| 24416.8028 | 2124.46 |
| 24427.0428 | 2125.82 |
| 24437.2829 | 2125.82 |
| 24447.523 | 2125.82 |
| 24457.7631 | 2125.82 |
| 24468.0031 | 2125.82 |
| 24478.2432 | 2128.48 |
| 24488.4833 | 2131.3 |
| 24498.7234 | 2128.78 |
| 24508.9634 | 2128.63 |
| 24519.2035 | 2131.3 |
| 24529.4436 | 2130.12 |
| 24539.6837 | 2138.03 |
| 24549.9237 | 2138.49 |
| 24560.1638 | 2137.15 |
| 24570.4039 | 2119.77 |
| 24580.644 | 2133.42 |
| 24590.884 | 2114.29 |
| 24601.1241 | 2113.15 |
| 24611.3642 | 2109.15 |
| 24621.6043 | 2104.93 |
| 24631.8443 | 2104.7 |
| 24642.0844 | 2111.36 |
| 24652.3245 | 2111.74 |
| 24662.5646 | 2109.08 |
| 24672.8046 | 2107.59 |
| 24683.0447 | 2111.51 |
| 24693.2848 | 2111.74 |
| 24703.5249 | 2115.73 |
| 24713.7649 | 2118.63 |
| 24724.005 | 2134.75 |
| 24734.2451 | 2135.67 |
| 24744.4852 | 2139.66 |
| 24754.7252 | 2141.22 |
| 24764.9653 | 2143.96 |
| 24775.2054 | 2154.76 |
| 24785.4455 | 2156.71 |
| 24795.6855 | 2162.11 |
| 24805.9256 | 2167.74 |
| 24816.1657 | 2184.01 |
| 24826.4058 | 2183.61 |
| 24836.6458 | 2182.2 |
| 24846.8859 | 2182.12 |
| 24857.126 | 2183.45 |
| 24867.3661 | 2184.86 |
| 24877.6061 | 2190.26 |
| 24887.8462 | 2194.56 |
| 24898.0863 | 2196.12 |
| 24908.3264 | 2197.53 |
| 24918.5664 | 2198.94 |
| 24928.8065 | 2203 |
| 24939.0466 | 2207.22 |
| 24949.2867 | 2212.78 |
| 24959.5267 | 2214.42 |
| 24969.7668 | 2215.83 |
| 24980.0069 | 2217.23 |
| 24990.247 | 2217.31 |
| 25000.487 | 2217.31 |
| 25010.7271 | 2218.64 |
| 25020.9672 | 2222.71 |
| 25031.2073 | 2224.27 |
| 25041.4473 | 2225.68 |
| 25051.6874 | 2225.76 |
| 25061.9275 | 2224.43 |
| 25072.1676 | 2228.34 |
| 25082.4076 | 2228.57 |
| 25092.6477 | 2231.23 |
| 25102.8878 | 2238.03 |
| 25113.1279 | 2239.76 |
| 25123.3679 | 2241.16 |
| 25133.608 | 2245.23 |
| 25143.8481 | 2246.79 |
| 25154.0882 | 2250.86 |
| 25164.3282 | 2255.08 |
| 25174.5683 | 2283.22 |
| 25184.8084 | 2287.53 |
| 25195.0485 | 2283.71 |
| 25205.2885 | 2282.14 |
| 25215.5286 | 2286.05 |
| 25225.7687 | 2290.27 |
| 25236.0088 | 2317.07 |
| 25246.2488 | 2314.68 |
| 25256.4889 | 2310.45 |
| 25266.729 | 2314.2 |
| 25276.9691 | 2318.42 |
| 25287.2091 | 2322.64 |
| 25297.4492 | 2325.54 |
| 25307.6893 | 2325.7 |
| 25317.9294 | 2327.03 |
| 25328.1694 | 2296.57 |
| 25338.4095 | 2290.75 |
| 25348.6496 | 2286.52 |
| 25358.8897 | 2287.61 |
| 25369.1297 | 2283.71 |
| 25379.3698 | 2283.47 |
| 25389.6099 | 2280.81 |
| 25399.85 | 2279.33 |
| 25410.09 | 2280.57 |
| 25420.3301 | 2284.64 |
| 25430.5702 | 2278.24 |
| 25440.8103 | 2277.84 |
| 25451.0503 | 2268.55 |
| 25461.2904 | 2225.51 |
| 25471.5305 | 2222.94 |
| 25481.7706 | 2221.62 |
| 25492.0106 | 2218.88 |
| 25502.2507 | 2216.07 |
| 25512.4908 | 2215.9 |
| 25522.7308 | 2215.9 |
| 25532.9709 | 2214.58 |
| 25543.211 | 2215.82 |
| 25553.4511 | 2215.9 |
| 25563.6911 | 2215.9 |
| 25573.9312 | 2214.58 |
| 25584.1713 | 2214.5 |
| 25594.4114 | 2214.5 |
| 25604.6514 | 2215.82 |
| 25614.8915 | 2219.88 |
| 25625.1316 | 2237.37 |
| 25635.3717 | 2234.45 |
| 25645.6117 | 2230.22 |
| 25655.8518 | 2231.31 |
| 25666.0919 | 2234.04 |
| 25676.332 | 2262.05 |
| 25686.572 | 2262.44 |
| 25696.8121 | 2258.38 |
| 25707.0522 | 2262.11 |
| 25717.2923 | 2263.68 |
| 25727.5323 | 2278.35 |
| 25737.7724 | 2279.25 |
| 25748.0125 | 2281.9 |
| 25758.2526 | 2284.71 |
| 25768.4926 | 2288.86 |
| 25778.7327 | 2289.1 |
| 25788.9728 | 2287.77 |
| 25799.2129 | 2296.97 |
| 25809.4529 | 2296.22 |
| 25819.693 | 2293.49 |
| 25829.9331 | 2293.32 |
| 25840.1732 | 2292 |
| 25850.4132 | 2291.92 |
| 25860.6533 | 2291.92 |
| 25870.8934 | 2295.89 |
| 25881.1335 | 2296.14 |
| 25891.3735 | 2306.74 |
| 25901.6136 | 2306.07 |
| 25911.8537 | 2302.02 |
| 25922.0938 | 2300.44 |
| 25932.3338 | 2299.04 |
| 25942.5739 | 2302.93 |
| 25952.814 | 2301.85 |
| 25963.0541 | 2303.09 |
| 25973.2941 | 2304.5 |
| 25983.5342 | 2307.23 |
| 25993.7743 | 2307.4 |
| 26004.0144 | 2288.85 |
| 26014.2544 | 2286.37 |
| 26024.4945 | 2288.93 |
| 26034.7346 | 2287.78 |
| 26044.9747 | 2287.69 |
| 26055.2147 | 2287.69 |
| 26065.4548 | 2285.04 |
| 26075.6949 | 2288.85 |
| 26085.935 | 2291.75 |
| 26096.175 | 2291.92 |
| 26106.4151 | 2293.24 |
| 26116.6552 | 2297.3 |
| 26126.8953 | 2279.01 |
| 26137.1353 | 2275.19 |
| 26147.3754 | 2273.7 |
| 26157.6155 | 2277.59 |
| 26167.8556 | 2280.49 |
| 26178.0956 | 2281.98 |
| 26188.3357 | 2282.06 |
| 26198.5758 | 2280.74 |
| 26208.8159 | 2280.65 |
| 26219.0559 | 2283.3 |
| 26229.296 | 2279.5 |
| 26239.5361 | 2283.22 |
| 26249.7762 | 2287.44 |
| 26260.0162 | 2287.69 |
| 26270.2563 | 2304.9 |
| 26280.4964 | 2305.99 |
| 26290.7365 | 2308.64 |
| 26300.9765 | 2308.81 |
| 26311.2166 | 2311.45 |
| 26321.4567 | 2310.3 |
| 26331.6968 | 2311.54 |
| 26341.9368 | 2312.95 |
| 26352.1769 | 2314.35 |
| 26362.417 | 2315.76 |
| 26372.6571 | 2317.17 |
| 26382.8971 | 2322.21 |
| 26393.1372 | 2327.49 |
| 26403.3773 | 2332.77 |
| 26413.6174 | 2338.05 |
| 26423.8574 | 2343.66 |
| 26434.0975 | 2349.29 |
| 26444.3376 | 2354.92 |
| 26454.5777 | 2361.87 |
| 26464.8177 | 2368.91 |
| 26475.0578 | 2376.83 |
| 26485.2979 | 2384.81 |
| 26495.538 | 2392.78 |
| 26505.778 | 2401.2 |
| 26516.0181 | 2409.64 |
| 26526.2582 | 2423.38 |
| 26536.4983 | 2437.45 |
| 26546.7383 | 2453.51 |
| 26556.9784 | 2469.7 |
| 26567.2185 | 2473 |
| 26577.4586 | 2475.46 |
| 26587.6986 | 2477.92 |
| 26597.9387 | 2480.39 |
| 26608.1788 | 2474.81 |
| 26618.4189 | 2468.71 |
| 26628.6589 | 2462.61 |
| 26638.899 | 2450.34 |
| 26649.1391 | 2437.67 |
| 26659.3792 | 2425.01 |
| 26669.6192 | 2412.34 |
| 26679.8593 | 2385.13 |
| 26690.0994 | 2356.98 |
| 26700.3395 | 2332.79 |
| 26710.5795 | 2314.15 |
| 26720.8196 | 2313.03 |
| 26731.0597 | 2307.74 |
| 26741.2998 | 2307.4 |
| 26751.5398 | 2303.44 |
| 26761.7799 | 2296.57 |
| 26772.02 | 2294.82 |
| 26782.2601 | 2294.73 |
| 26792.5001 | 2297.37 |
| 26802.7402 | 2279.05 |
| 26812.9803 | 2273.88 |
| 26823.2204 | 2276.26 |
| 26833.4604 | 2267.19 |
| 26843.7005 | 2262.62 |
| 26853.9406 | 2261.04 |
| 26864.1807 | 2262.27 |
| 26874.4207 | 2259.71 |
| 26884.6608 | 2262.18 |
| 26894.9009 | 2258.39 |
| 26905.141 | 2254.17 |
| 26915.381 | 2252.59 |
| 26925.6211 | 2253.82 |
| 26935.8612 | 2235.43 |
| 26946.1013 | 2234.2 |
| 26956.3413 | 2231.56 |
| 26966.5814 | 2231.39 |
| 26976.8215 | 2235.35 |
| 26987.0616 | 2232.97 |
| 26997.3016 | 2230.16 |
| 27007.5417 | 2231.3 |
| 27017.7818 | 2232.71 |
| 27028.0219 | 2235.44 |
| 27038.2619 | 2235.61 |
| 27048.502 | 2229.01 |
| 27058.7421 | 2224.61 |
| 27068.9822 | 2220.39 |
| 27079.2222 | 2220.13 |
| 27089.4623 | 2218.81 |
| 27099.7024 | 2214.76 |
| 27109.9425 | 2215.82 |
| 27120.1825 | 2218.54 |
| 27130.4226 | 2222.68 |
| 27140.6627 | 2218.98 |
| 27150.9028 | 2218.72 |
| 27161.1428 | 2218.72 |
| 27171.3829 | 2210.8 |
| 27181.623 | 2210.27 |
| 27191.8631 | 2210.27 |
| 27202.1031 | 2211.59 |
| 27212.3432 | 2211.68 |
| 27222.5833 | 2214.32 |
| 27232.8234 | 2213.18 |
| 27243.0634 | 2215.73 |
| 27253.3035 | 2215.9 |
| 27263.5436 | 2215.9 |
| 27273.7837 | 2215.9 |
| 27284.0237 | 2233.05 |
| 27294.2638 | 2238.16 |
| 27304.5039 | 2242.38 |
| 27314.744 | 2242.65 |
| 27324.984 | 2241.33 |
| 27335.2241 | 2262.34 |
| 27345.4642 | 2259.81 |
| 27355.7043 | 2259.54 |
| 27365.9443 | 2255.59 |
| 27376.1844 | 2255.32 |
| 27386.4245 | 2272.46 |
| 27396.6646 | 2277.57 |
| 27406.9046 | 2279.16 |
| 27417.1447 | 2291.11 |
| 27427.3848 | 2291.92 |
| 27437.6249 | 2295.87 |
| 27447.8649 | 2292.18 |
| 27458.105 | 2295.87 |
| 27468.3451 | 2300.09 |
| 27478.5852 | 2308.27 |
| 27488.8252 | 2304.85 |
| 27499.0653 | 2300.63 |
| 27509.3054 | 2304.31 |
| 27519.5455 | 2311.17 |
| 27529.7855 | 2310.3 |
| 27540.0256 | 2314.17 |
| 27550.2657 | 2314.44 |
| 27560.5058 | 2326.29 |
| 27570.7458 | 2329.74 |
| 27580.9859 | 2332.56 |
| 27591.226 | 2345.91 |
| 27601.4661 | 2345.5 |
| 27611.7061 | 2353.31 |
| 27621.9462 | 2356.49 |
| 27632.1863 | 2356.67 |
| 27642.4264 | 2373.79 |
| 27652.6664 | 2374.97 |
| 27662.9065 | 2384.18 |
| 27673.1466 | 2386.14 |
| 27683.3867 | 2390.18 |
| 27693.6267 | 2402.3 |
| 27703.8668 | 2403.12 |
| 27714.1069 | 2407.07 |
| 27724.347 | 2408.66 |
| 27734.587 | 2408.75 |
| 27744.8271 | 2402.16 |
| 27755.0672 | 2401.71 |
| 27765.3073 | 2403.03 |
| 27775.5473 | 2414.97 |
| 27785.7874 | 2414.47 |
| 27796.0275 | 2415.69 |
| 27806.2676 | 2417.1 |
| 27816.5076 | 2419.83 |
| 27826.7477 | 2423.96 |
| 27836.9878 | 2418.97 |
| 27847.2279 | 2422.55 |
| 27857.4679 | 2420.19 |
| 27867.708 | 2406.85 |
| 27877.9481 | 2403.3 |
| 27888.1882 | 2399.17 |
| 27898.4282 | 2385.74 |
| 27908.6683 | 2383.5 |
| 27918.9084 | 2387.36 |
| 27929.1485 | 2363.95 |
| 27939.3885 | 2360.98 |
| 27949.6286 | 2354.31 |
| 27959.8687 | 2356.48 |
| 27970.1088 | 2354.03 |
| 27980.3488 | 2335.43 |
| 27990.5889 | 2338.09 |
| 28000.829 | 2335.74 |
| 28011.0691 | 2334.24 |
| 28021.3091 | 2322.31 |
| 28031.5492 | 2321.48 |
| 28041.7893 | 2321.48 |
| 28052.0294 | 2324.11 |
| 28062.2694 | 2324.29 |
| 28072.5095 | 2324.29 |
| 28082.7496 | 2304.57 |
| 28092.9897 | 2307.12 |
| 28103.2297 | 2303.45 |
| 28113.4698 | 2300.55 |
| 28123.7099 | 2300.36 |
| 28133.95 | 2301.68 |
| 28144.19 | 2285.99 |
| 28154.4301 | 2284.88 |
| 28164.6702 | 2283.56 |
| 28174.9103 | 2280.84 |
| 28185.1503 | 2280.65 |
| 28195.3904 | 2276.71 |
| 28205.6305 | 2268.55 |
| 28215.8706 | 2273.24 |
| 28226.1106 | 2249.96 |
| 28236.3507 | 2237.77 |
| 28246.5908 | 2230.45 |
| 28256.8309 | 2229.98 |
| 28267.071 | 2219.47 |
| 28277.311 | 2204.26 |
| 28287.5511 | 2212.43 |
| 28297.7912 | 2190.75 |
| 28308.0313 | 2178.65 |
| 28318.2713 | 2184.47 |
| 28328.5114 | 2153.4 |
| 28338.7515 | 2162.98 |
| 28348.9916 | 2161.2 |
| 28359.2316 | 2159.69 |
| 28369.4717 | 2139.89 |
| 28379.7118 | 2138.49 |
| 28389.9519 | 2113.53 |
| 28400.1919 | 2115.68 |
| 28410.432 | 2109.4 |
| 28420.6721 | 2098.42 |
| 28430.9122 | 2095.04 |
| 28441.1522 | 2094.85 |
| 28451.3923 | 2096.16 |
| 28461.6324 | 2063.43 |
| 28471.8725 | 2050.56 |
| 28482.1125 | 2049.81 |
| 28492.3526 | 2053.75 |
| 28502.5927 | 2068.47 |
| 28512.8328 | 2072.14 |
| 28523.0728 | 2099.9 |
| 28533.3129 | 2103.2 |
| 28543.553 | 2109.86 |
| 28553.7931 | 2107.71 |
| 28564.0331 | 2111.46 |
| 28574.2732 | 2116.99 |
| 28584.5133 | 2121.31 |
| 28594.7534 | 2109.78 |
| 28604.9934 | 2132.55 |
| 28615.2335 | 2150.01 |
| 28625.4736 | 2145.9 |
| 28635.7137 | 2140.27 |
| 28645.9537 | 2159.58 |
| 28656.1938 | 2158.38 |
| 28666.4339 | 2147.69 |
| 28676.674 | 2161.37 |
| 28686.914 | 2165.04 |
| 28697.1541 | 2165.23 |
| 28707.3942 | 2157.36 |
| 28717.6343 | 2186.96 |
| 28727.8743 | 2185.22 |
| 28738.1144 | 2179.69 |
| 28748.3545 | 2179.31 |
| 28758.5946 | 2180.62 |
| 28768.8346 | 2185.96 |
| 28779.0747 | 2185.03 |
| 28789.3148 | 2187.56 |
| 28799.5549 | 2185.13 |
| 28809.7949 | 2184.94 |
| 28820.035 | 2187.56 |
| 28830.2751 | 2183.82 |
| 28840.5152 | 2191.4 |
| 28850.7552 | 2194.6 |
| 28860.9953 | 2196.1 |
| 28871.2354 | 2190.95 |
| 28881.4755 | 2191.88 |
| 28891.7155 | 2191.97 |
| 28901.9556 | 2197.22 |
| 28912.1957 | 2198.92 |
| 28922.4358 | 2197.7 |
| 28932.6758 | 2196.29 |
| 28942.9159 | 2194.89 |
| 28953.156 | 2198.72 |
| 28963.3961 | 2201.63 |
| 28973.6361 | 2192.65 |
| 28983.8762 | 2188.04 |
| 28994.1163 | 2210.04 |
| 29004.3564 | 2211.68 |
| 29014.5964 | 2209.06 |
| 29024.8365 | 2207.56 |
| 29035.0766 | 2206.15 |
| 29045.3167 | 2207.36 |
| 29055.5567 | 2207.46 |
| 29065.7968 | 2207.46 |
| 29076.0369 | 2210.08 |
| 29086.277 | 2203.72 |
| 29096.517 | 2209.79 |
| 29106.7571 | 2207.65 |
| 29116.9972 | 2202.22 |
| 29127.2373 | 2197.9 |
| 29137.4773 | 2202.85 |
| 29147.7174 | 2203.24 |
| 29157.9575 | 2203.24 |
| 29168.1976 | 2203.24 |
| 29178.4376 | 2205.86 |
| 29188.6777 | 2207.36 |
| 29198.9178 | 2164.23 |
| 29209.1579 | 2151.84 |
| 29219.3979 | 2149.84 |
| 29229.638 | 2190.35 |
| 29239.8781 | 2169.81 |
| 29250.1182 | 2169.36 |
| 29260.3582 | 2166.83 |
| 29270.5983 | 2174.49 |
| 29280.8384 | 2171.16 |
| 29291.0785 | 2160.39 |
| 29301.3185 | 2155.67 |
| 29311.5586 | 2156.69 |
| 29321.7987 | 2125.36 |
| 29332.0388 | 2150.5 |
| 29342.2788 | 2149.94 |
| 29352.5189 | 2149.75 |
| 29362.759 | 2149.75 |
| 29372.9991 | 2147.13 |
| 29383.2391 | 2146.93 |
| 29393.4792 | 2146.93 |
| 29403.7193 | 2145.62 |
| 29413.9594 | 2148.14 |
| 29424.1994 | 2148.34 |
| 29434.4395 | 2150.96 |
| 29444.6796 | 2152.46 |
| 29454.9197 | 2153.87 |
| 29465.1597 | 2156.59 |
| 29475.3998 | 2160.71 |
| 29485.6399 | 2229.05 |
| 29495.88 | 2265.61 |
| 29506.1201 | 2267.99 |
| 29516.3601 | 2265.37 |
| 29526.6002 | 2258.63 |
| 29536.8403 | 2265.98 |
| 29547.0804 | 2267.89 |
| 29557.3204 | 2266.68 |
| 29567.5605 | 2267.89 |
| 29577.8006 | 2266.68 |
| 29588.0407 | 2265.27 |
| 29598.2807 | 2265.17 |
| 29608.5208 | 2263.86 |
| 29618.7609 | 2266.38 |
| 29629.001 | 2267.89 |
| 29639.241 | 2264.06 |
| 29649.4811 | 2263.76 |
| 29659.7212 | 2263.76 |
| 29669.9613 | 2262.46 |
| 29680.2013 | 2259.74 |
| 29690.4414 | 2258.23 |
| 29700.6815 | 2258.13 |
| 29710.9216 | 2255.52 |
| 29721.1616 | 2256.63 |
| 29731.4017 | 2256.73 |
| 29741.6418 | 2254.11 |
| 29751.8819 | 2278.75 |
| 29762.1219 | 2276.73 |
| 29772.362 | 2279.05 |
| 29782.6021 | 2277.94 |
| 29792.8422 | 2281.76 |
| 29803.0822 | 2285.98 |
| 29813.3223 | 2290.21 |
| 29823.5624 | 2294.43 |
| 29833.8025 | 2284.28 |
| 29844.0425 | 2279.55 |
| 29854.2826 | 2275.33 |
| 29864.5227 | 2275.02 |
| 29874.7628 | 2259.34 |
| 29885.0028 | 2258.13 |
| 29895.2429 | 2235.92 |
| 29905.483 | 2236.82 |
| 29915.7231 | 2203.05 |
| 29925.9631 | 2231.78 |
| 29936.2032 | 2200.24 |
| 29946.4433 | 2196.3 |
| 29956.6834 | 2205.34 |
| 29966.9234 | 2202.13 |
| 29977.1635 | 2200.52 |
| 29987.4036 | 2206.95 |
| 29997.6437 | 2202.23 |
| 30007.8837 | 2212.28 |
| 30018.1238 | 2217.01 |
| 30028.3639 | 2182.05 |
| 30038.604 | 2198.9 |
| 30048.844 | 2197.81 |
| 30059.0841 | 2179.32 |
| 30069.3242 | 2173.98 |
| 30079.5643 | 2173.68 |
| 30089.8043 | 2165.84 |
| 30100.0444 | 2162.62 |
| 30110.2845 | 2162.42 |
| 30120.5246 | 2155.89 |
| 30130.7646 | 2156.68 |
| 30141.0047 | 2158.09 |
| 30151.2448 | 2164.72 |
| 30161.4849 | 2190.03 |
| 30171.7249 | 2199.81 |
| 30181.965 | 2199.12 |
| 30192.2051 | 2239.47 |
| 30202.4452 | 2328.79 |
| 30212.6852 | 2338.16 |
| 30222.9253 | 2344.89 |
| 30233.1654 | 2328.44 |
| 30243.4055 | 2340.16 |
| 30253.6455 | 2324.22 |
| 30263.8856 | 2338.54 |
| 30274.1257 | 2334.56 |
| 30284.3658 | 2306.74 |
| 30294.6058 | 2295.45 |
| 30304.8459 | 2302.56 |
| 30315.086 | 2294.04 |
| 30325.3261 | 2280.28 |
| 30335.5662 | 2281.86 |
| 30345.8062 | 2267.71 |
| 30356.0463 | 2231.36 |
| 30366.2864 | 2224.66 |
| 30376.5265 | 2223.05 |
| 30386.7665 | 2196.86 |
| 30397.0066 | 2194.79 |
| 30407.2467 | 2193.49 |
| 30417.4868 | 2186.86 |
| 30427.7268 | 2187.65 |
| 30437.9669 | 2162.98 |
| 30448.207 | 2146.66 |
| 30458.4471 | 2094.67 |
| 30468.6871 | 2090.63 |
| 30478.9272 | 2086.72 |
| 30489.1673 | 2079.88 |
| 30499.4074 | 2078.06 |
| 30509.6474 | 2076.65 |
| 30519.8875 | 2075.25 |
| 30530.1276 | 2071.23 |
| 30540.3677 | 2070.92 |
| 30550.6077 | 2069.62 |
| 30560.8478 | 2072.12 |
| 30571.0879 | 2072.33 |
| 30581.328 | 2068.42 |
| 30591.568 | 2070.71 |
| 30601.8081 | 2072.22 |
| 30612.0482 | 2099.7 |
| 30622.2883 | 2101.89 |
| 30632.5283 | 2103.19 |
| 30642.7684 | 2103.3 |
| 30653.0085 | 2104.6 |
| 30663.2486 | 2125.55 |
| 30673.4886 | 2129.83 |
| 30683.7287 | 2131.34 |
| 30693.9688 | 2131.45 |
| 30704.2089 | 2179.65 |
| 30714.4489 | 2182.23 |
| 30724.689 | 2209.48 |
| 30734.9291 | 2212.98 |
| 30745.1692 | 2235.23 |
| 30755.4092 | 2235.72 |
| 30765.6493 | 2235.61 |
| 30775.8894 | 2234.31 |
| 30786.1295 | 2242.02 |
| 30796.3695 | 2255.67 |
| 30806.6096 | 2256.73 |
| 30816.8497 | 2264.54 |
| 30827.0898 | 2266.47 |
| 30837.3298 | 2273.09 |
| 30847.5699 | 2273.62 |
| 30857.81 | 2277.52 |
| 30868.0501 | 2277.84 |
| 30878.2901 | 2277.84 |
| 30888.5302 | 2283.05 |
| 30898.7703 | 2288.68 |
| 30909.0104 | 2243.54 |
| 30919.2504 | 2228.12 |
| 30929.4905 | 2215.45 |
| 30939.7306 | 2202.78 |
| 30949.9707 | 2193.37 |
| 30960.2107 | 2184.22 |
| 30970.4508 | 2178.32 |
| 30980.6909 | 2172.69 |
| 30990.931 | 2167.06 |
| 31001.1711 | 2161.43 |
| 31011.4111 | 2156.45 |
| 31021.6512 | 2151.53 |
| 31031.8913 | 2146.6 |
| 31042.1314 | 2141.67 |
| 31052.3714 | 2137.4 |
| 31062.6115 | 2135.78 |
| 31072.8516 | 2133.07 |
| 31083.0917 | 2135.46 |
| 31093.3317 | 2130.47 |
| 31103.5718 | 2130.04 |
| 31113.8119 | 2132.64 |
| 31124.052 | 2134.16 |
| 31134.292 | 2134.26 |
| 31144.5321 | 2138.17 |
| 31154.7722 | 2139.79 |
| 31165.0123 | 2143.8 |
| 31175.2523 | 2148.02 |
| 31185.4924 | 2152.24 |
| 31195.7325 | 2159.06 |
| 31205.9726 | 2159.6 |
| 31216.2126 | 2159.6 |
| 31226.4527 | 2163.93 |
| 31236.6928 | 2168.63 |
| 31246.9329 | 2173.32 |
| 31257.1729 | 2179.53 |
| 31267.413 | 2185.86 |
| 31277.6531 | 2192.2 |
| 31287.8932 | 2198.53 |
| 31298.1332 | 2201.61 |
| 31308.3733 | 2204.43 |
| 31318.6134 | 2202.69 |
| 31328.8535 | 2200.58 |
| 31339.0935 | 2198.47 |
| 31349.3336 | 2196.36 |
| 31359.5737 | 2192.3 |
| 31369.8138 | 2188.08 |
| 31380.0538 | 2183.85 |
| 31390.2939 | 2179.63 |
| 31400.534 | 2173.67 |
| 31410.7741 | 2167.58 |
| 31421.0141 | 2161.48 |
| 31431.2542 | 2155.81 |
| 31441.4943 | 2150.18 |
| 31451.7344 | 2146.17 |
| 31461.9744 | 2142.3 |
| 31472.2145 | 2138.43 |
| 31482.4546 | 2134.56 |
| 31492.6947 | 2130.37 |
| 31502.9347 | 2126.14 |
| 31513.1748 | 2123.22 |
| 31523.4149 | 2123 |
| 31533.655 | 2121.7 |
| 31543.895 | 2120.3 |
| 31554.1351 | 2120.19 |
| 31564.3752 | 2121.49 |
| 31574.6153 | 2121.59 |
| 31584.8554 | 2124.19 |
| 31595.0954 | 2125.71 |
| 31605.3355 | 2129.71 |
| 31615.5756 | 2141.73 |
| 31625.8157 | 2138.81 |
| 31636.0557 | 2138.49 |
| 31646.2958 | 2163.16 |
| 31656.5359 | 2161.34 |
| 31666.776 | 2170.1 |
| 31677.016 | 2172.16 |
| 31687.2561 | 2190.44 |
| 31697.4962 | 2204.96 |
| 31707.7363 | 2208.65 |
| 31717.9763 | 2225.74 |
| 31728.2164 | 2228.46 |
| 31738.4565 | 2229.87 |
| 31748.6966 | 2236.47 |
| 31758.9366 | 2234.42 |
| 31769.1767 | 2238.1 |
| 31779.4168 | 2242.32 |
| 31789.6569 | 2234.86 |
| 31799.8969 | 2232.91 |
| 31810.137 | 2228.9 |
| 31820.3771 | 2228.57 |
| 31830.6172 | 2215.6 |
| 31840.8572 | 2218.39 |
| 31851.0973 | 2217.42 |
| 31861.3374 | 2217.31 |
| 31871.5775 | 2218.61 |
| 31881.8175 | 2217.42 |
| 31892.0576 | 2216.01 |
| 31902.2977 | 2215.9 |
| 31912.5378 | 2217.2 |
| 31922.7778 | 2216.01 |
| 31933.0179 | 2215.9 |
| 31943.258 | 2226.28 |
| 31953.4981 | 2231.06 |
| 31963.7381 | 2231.39 |
| 31973.9782 | 2233.98 |
| 31984.2183 | 2234.2 |
| 31994.4584 | 2239.39 |
| 32004.6984 | 2225.57 |
| 32014.9385 | 2220.46 |
| 32025.1786 | 2218.83 |
| 32035.4187 | 2217.42 |
| 32045.6587 | 2218.61 |
| 32055.8988 | 2217.42 |
| 32066.1389 | 2217.31 |
| 32076.379 | 2217.31 |
| 32086.6191 | 2219.9 |
| 32096.8591 | 2221.42 |
| 32107.0992 | 2224.13 |
| 32117.3393 | 2236.02 |
| 32127.5794 | 2238.31 |
| 32137.8194 | 2238.43 |
| 32148.0595 | 2242.31 |
| 32158.2996 | 2250.43 |
| 32168.5397 | 2254.98 |
| 32178.7797 | 2259.21 |
| 32189.0198 | 2282.87 |
| 32199.2599 | 2280.99 |
| 32209.5 | 2283.25 |
| 32219.74 | 2295.13 |
| 32229.9801 | 2327.24 |
| 32240.2202 | 2333.81 |
| 32250.4603 | 2336.74 |
| 32260.7003 | 2340.85 |
| 32270.9404 | 2345.07 |
| 32281.1805 | 2323.38 |
| 32291.4206 | 2318.88 |
| 32301.6606 | 2314.77 |
| 32311.9007 | 2306.67 |
| 32322.1408 | 2303.4 |
| 32332.3809 | 2304.47 |
| 32342.6209 | 2303.29 |
| 32352.861 | 2296.7 |
| 32363.1011 | 2292.25 |
| 32373.3412 | 2293.21 |
| 32383.5812 | 2295.91 |
| 32393.8213 | 2296.14 |
| 32404.0614 | 2297.43 |
| 32414.3015 | 2297.55 |
| 32424.5415 | 2297.55 |
| 32434.7816 | 2298.84 |
| 32445.0217 | 2301.54 |
| 32455.2618 | 2304.36 |
| 32465.5018 | 2309.76 |
| 32475.7419 | 2314.1 |
| 32484.5021 | 2315.71 |